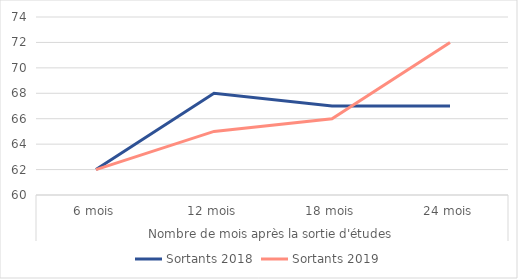
| Category | Sortants 2018 | Sortants 2019 |
|---|---|---|
| 0 | 62 | 62 |
| 1 | 68 | 65 |
| 2 | 67 | 66 |
| 3 | 67 | 72 |